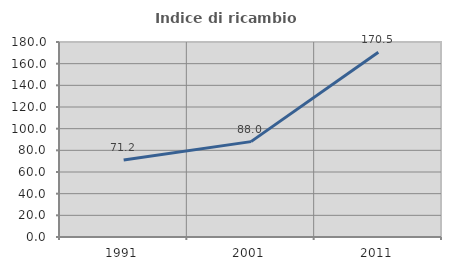
| Category | Indice di ricambio occupazionale  |
|---|---|
| 1991.0 | 71.152 |
| 2001.0 | 88.035 |
| 2011.0 | 170.538 |